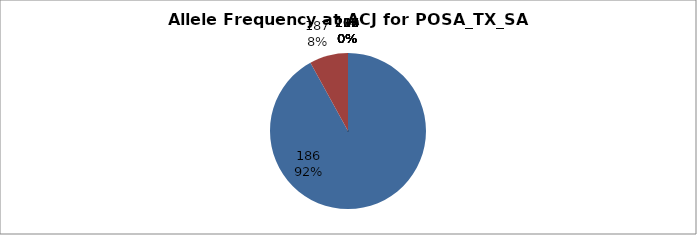
| Category | Series 0 |
|---|---|
| 186.0 | 0.92 |
| 187.0 | 0.08 |
| 188.0 | 0 |
| 190.0 | 0 |
| 202.0 | 0 |
| 204.0 | 0 |
| 206.0 | 0 |
| 207.0 | 0 |
| 208.0 | 0 |
| 209.0 | 0 |
| 210.0 | 0 |
| 212.0 | 0 |
| 214.0 | 0 |
| 227.0 | 0 |